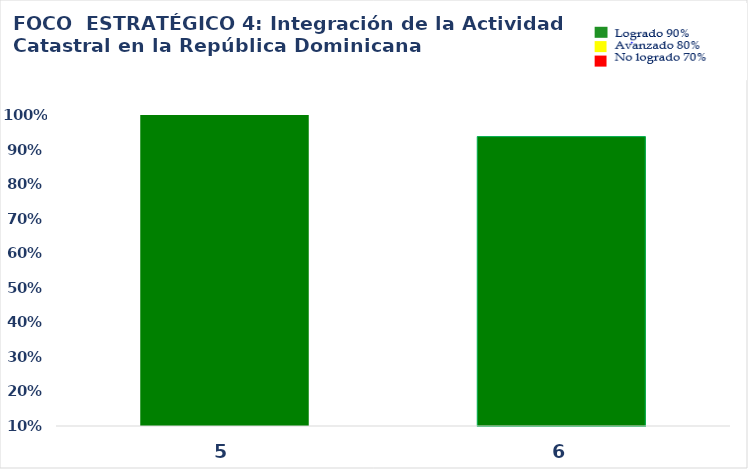
| Category | Series 0 |
|---|---|
| 5.0 | 1 |
| 6.0 | 0.938 |